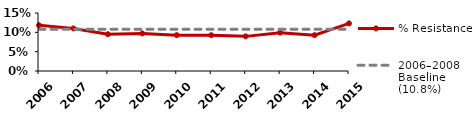
| Category | % Resistance | 2006–2008 Baseline (10.8%) |
|---|---|---|
| 2006.0 | 0.118 | 0.108 |
| 2007.0 | 0.11 | 0.108 |
| 2008.0 | 0.095 | 0.108 |
| 2009.0 | 0.097 | 0.108 |
| 2010.0 | 0.093 | 0.108 |
| 2011.0 | 0.093 | 0.108 |
| 2012.0 | 0.09 | 0.108 |
| 2013.0 | 0.099 | 0.108 |
| 2014.0 | 0.093 | 0.108 |
| 2015.0 | 0.123 | 0.108 |